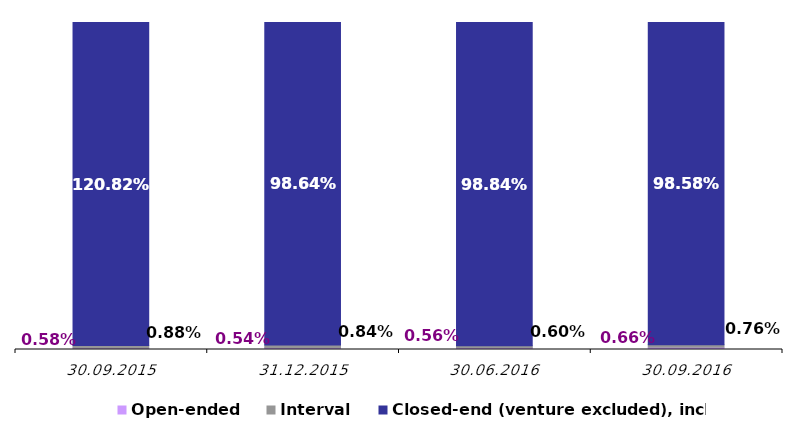
| Category | Open-ended | Interval | Closed-end (venture excluded), incl. |
|---|---|---|---|
| 30.09.2015 | 0.006 | 0.009 | 1.208 |
| 31.12.2015 | 0.005 | 0.008 | 0.986 |
| 30.06.2016 | 0.006 | 0.006 | 0.988 |
| 30.09.2016 | 0.007 | 0.008 | 0.986 |